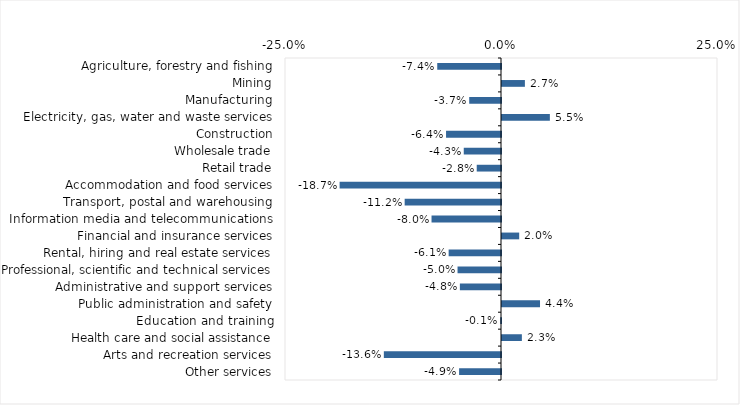
| Category | This week |
|---|---|
| Agriculture, forestry and fishing | -0.074 |
| Mining | 0.026 |
| Manufacturing | -0.037 |
| Electricity, gas, water and waste services | 0.055 |
| Construction | -0.064 |
| Wholesale trade | -0.043 |
| Retail trade | -0.028 |
| Accommodation and food services | -0.187 |
| Transport, postal and warehousing | -0.112 |
| Information media and telecommunications | -0.08 |
| Financial and insurance services | 0.02 |
| Rental, hiring and real estate services | -0.061 |
| Professional, scientific and technical services | -0.05 |
| Administrative and support services | -0.048 |
| Public administration and safety | 0.044 |
| Education and training | -0.001 |
| Health care and social assistance | 0.023 |
| Arts and recreation services | -0.136 |
| Other services | -0.048 |